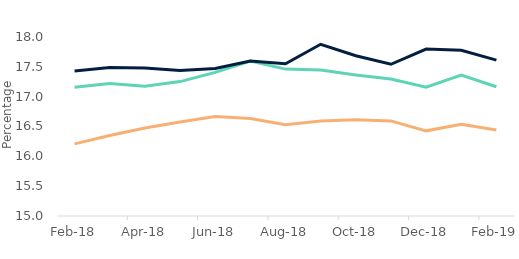
| Category | First-time
buyers | Homemovers | Remortgagors |
|---|---|---|---|
| 2018-02-01 | 17.158 | 17.429 | 16.209 |
| 2018-03-01 | 17.219 | 17.489 | 16.349 |
| 2018-04-01 | 17.176 | 17.479 | 16.475 |
| 2018-05-01 | 17.252 | 17.44 | 16.574 |
| 2018-06-01 | 17.407 | 17.473 | 16.669 |
| 2018-07-01 | 17.597 | 17.597 | 16.633 |
| 2018-08-01 | 17.462 | 17.551 | 16.53 |
| 2018-09-01 | 17.446 | 17.878 | 16.59 |
| 2018-10-01 | 17.365 | 17.687 | 16.613 |
| 2018-11-01 | 17.296 | 17.543 | 16.594 |
| 2018-12-01 | 17.159 | 17.798 | 16.427 |
| 2019-01-01 | 17.361 | 17.776 | 16.536 |
| 2019-02-01 | 17.166 | 17.613 | 16.442 |